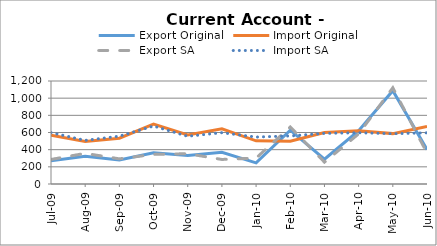
| Category | Export Original | Import Original | Export SA | Import SA |
|---|---|---|---|---|
| 2009-07-31 | 271 | 569.43 | 286 | 599 |
| 2009-08-31 | 323 | 495 | 357 | 508 |
| 2009-09-30 | 281 | 533 | 293 | 557 |
| 2009-10-31 | 363 | 698 | 345 | 675 |
| 2009-11-30 | 333 | 572 | 353 | 556 |
| 2009-12-31 | 369 | 644 | 286 | 598 |
| 2010-01-31 | 246 | 503 | 302 | 547 |
| 2010-02-28 | 627 | 498 | 664 | 560 |
| 2010-03-31 | 289 | 599 | 255 | 590 |
| 2010-04-30 | 622 | 619 | 584 | 597 |
| 2010-05-31 | 1087 | 587 | 1121 | 586 |
| 2010-06-30 | 402 | 670 | 362 | 596 |